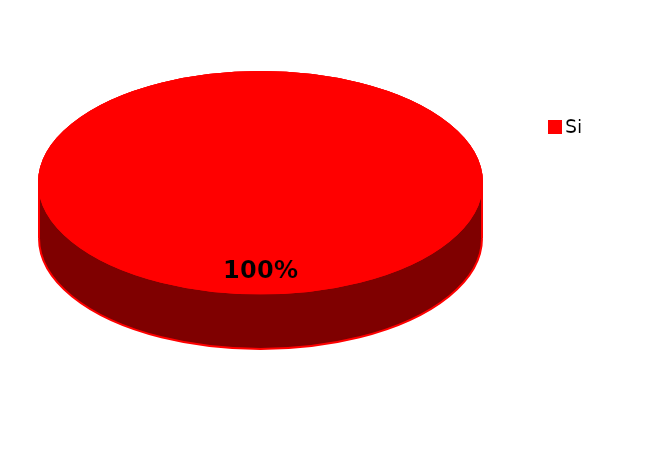
| Category | Series 0 |
|---|---|
| Si | 58 |